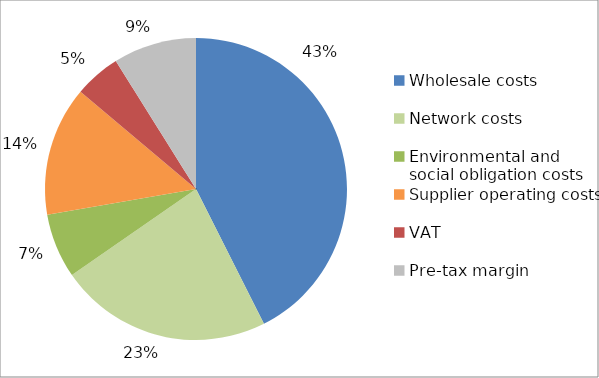
| Category | Series 0 |
|---|---|
| Wholesale costs | 0.43 |
| Network costs | 0.23 |
| Environmental and social obligation costs | 0.07 |
| Supplier operating costs | 0.14 |
| VAT | 0.05 |
| Pre-tax margin | 0.09 |